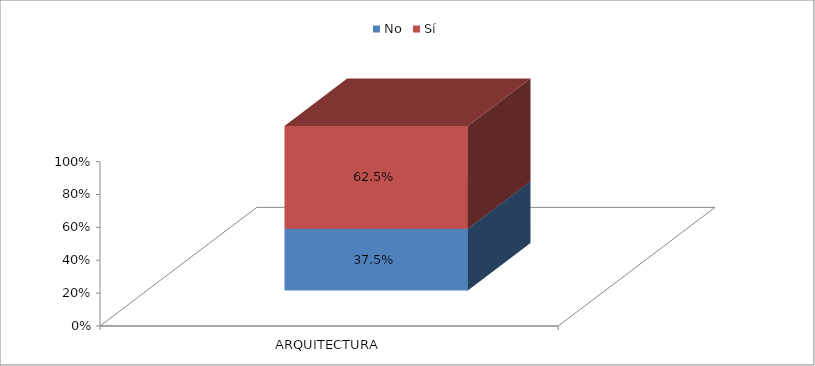
| Category | No | Sí |
|---|---|---|
| ARQUITECTURA | 0.375 | 0.625 |